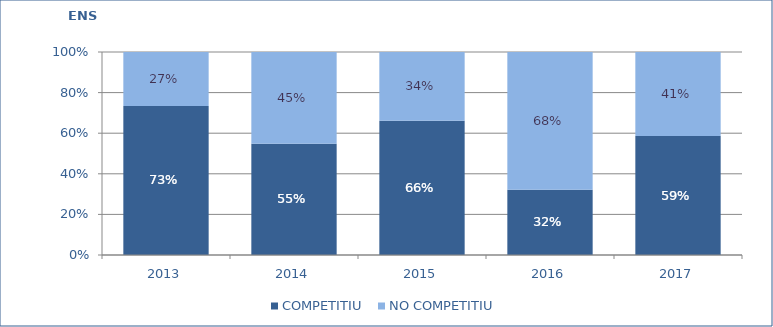
| Category | COMPETITIU  | NO COMPETITIU |
|---|---|---|
| 2013.0 | 0.734 | 0.266 |
| 2014.0 | 0.548 | 0.452 |
| 2015.0 | 0.662 | 0.338 |
| 2016.0 | 0.321 | 0.679 |
| 2017.0 | 0.586 | 0.414 |